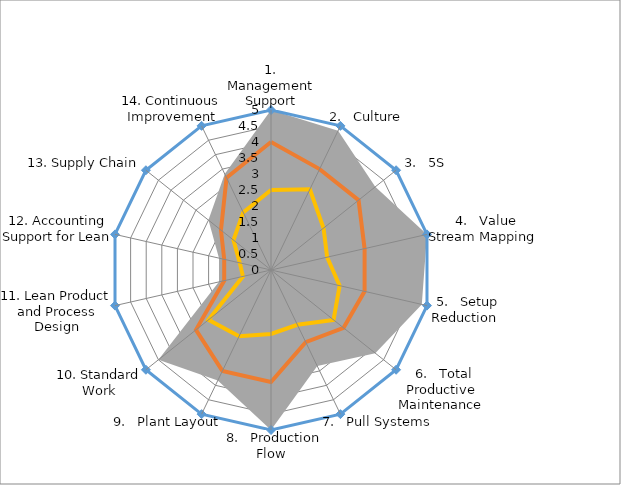
| Category | HF 22.3.011 |
|---|---|
|   1.   Management Support | 3 |
|   2.   Culture | 2.9 |
|   3.   5S | 2.5 |
|   4.   Value Stream Mapping | 3 |
|   5.   Setup Reduction | 2.9 |
|   6.   Total Productive Maintenance | 2.5 |
|   7.   Pull Systems | 2 |
|   8.   Production Flow | 3 |
|   9.   Plant Layout | 2.3 |
| 10. Standard Work | 2.7 |
| 11. Lean Product and Process Design | 1 |
| 12. Accounting Support for Lean | 1 |
| 13. Supply Chain | 1.5 |
| 14. Continuous Improvement | 2 |